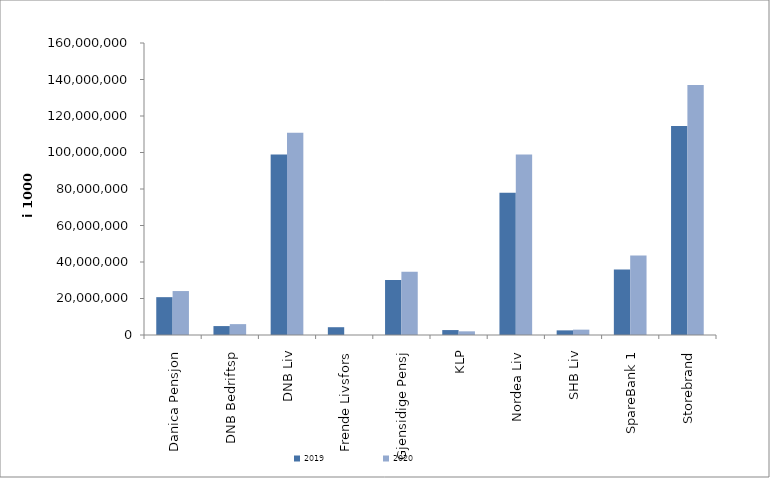
| Category | 2019 | 2020 |
|---|---|---|
| Danica Pensjon | 20732864.511 | 24084123.675 |
| DNB Bedriftsp | 4891857 | 5959168 |
| DNB Liv | 98943003.869 | 110860381.591 |
| Frende Livsfors | 4266127 | 0 |
| Gjensidige Pensj | 30130866 | 34697528 |
| KLP | 2703759.027 | 2013752.242 |
| Nordea Liv | 77977130 | 98862690 |
| SHB Liv | 2541186 | 2931716.441 |
| SpareBank 1 | 35920709.854 | 43584932.28 |
| Storebrand | 114501651.811 | 137052793.507 |